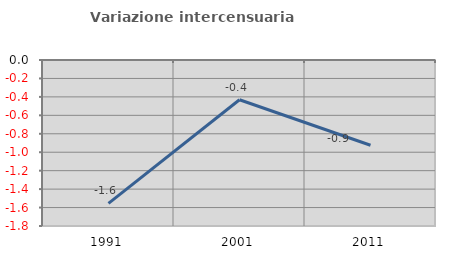
| Category | Variazione intercensuaria annua |
|---|---|
| 1991.0 | -1.554 |
| 2001.0 | -0.431 |
| 2011.0 | -0.925 |